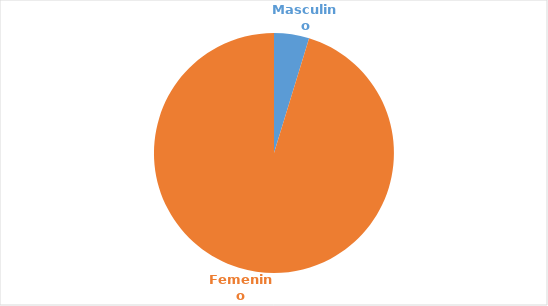
| Category | Series 0 |
|---|---|
| Masculino | 0.047 |
| Femenino | 0.953 |